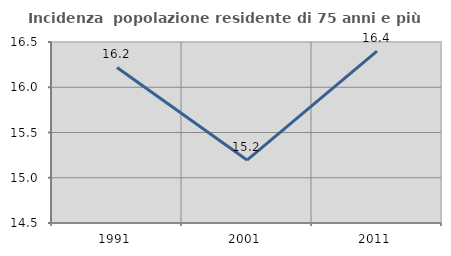
| Category | Incidenza  popolazione residente di 75 anni e più |
|---|---|
| 1991.0 | 16.219 |
| 2001.0 | 15.196 |
| 2011.0 | 16.398 |